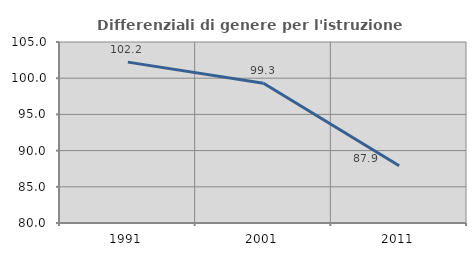
| Category | Differenziali di genere per l'istruzione superiore |
|---|---|
| 1991.0 | 102.222 |
| 2001.0 | 99.307 |
| 2011.0 | 87.899 |